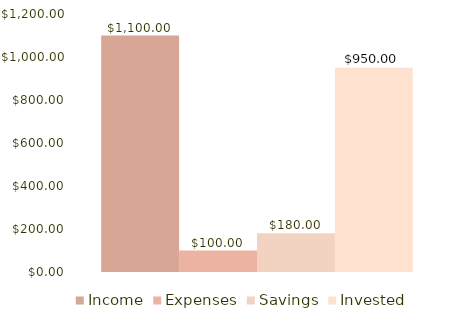
| Category | Income | Expenses | Savings | Invested |
|---|---|---|---|---|
| 0 | 1100 | 100 | 180 | 950 |